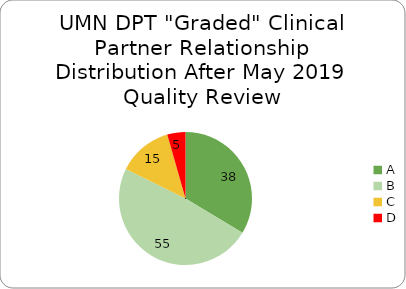
| Category | Number of partners  |
|---|---|
| A | 38 |
| B | 55 |
| C | 15 |
| D | 5 |